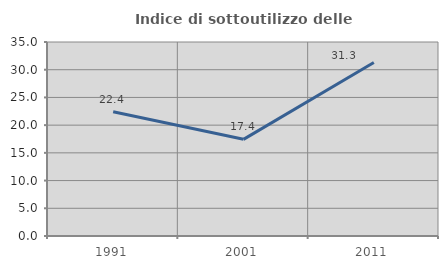
| Category | Indice di sottoutilizzo delle abitazioni  |
|---|---|
| 1991.0 | 22.43 |
| 2001.0 | 17.439 |
| 2011.0 | 31.309 |